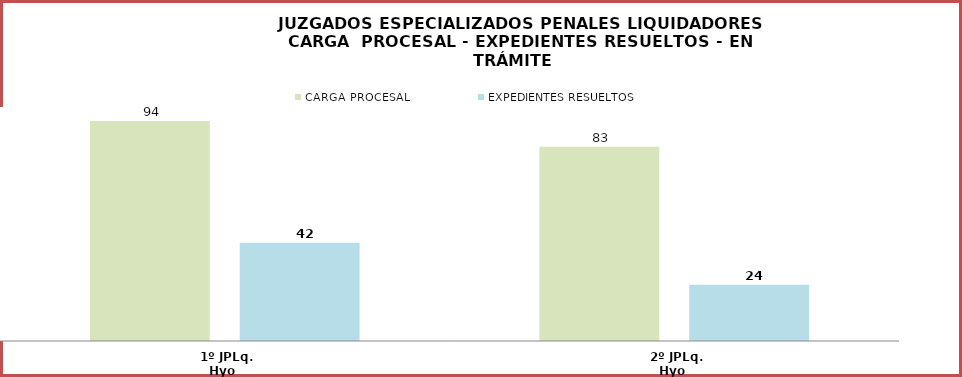
| Category | CARGA PROCESAL | EXPEDIENTES RESUELTOS |
|---|---|---|
| 1º JPLq. Hyo | 94 | 42 |
| 2º JPLq. Hyo | 83 | 24 |